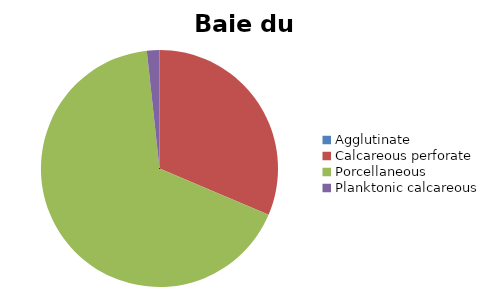
| Category | ﻿Baie du Levrier |
|---|---|
| ﻿Agglutinate | 0 |
| Calcareous perforate | 31.39 |
| Porcellaneous | 66.896 |
| Planktonic calcareous | 1.714 |